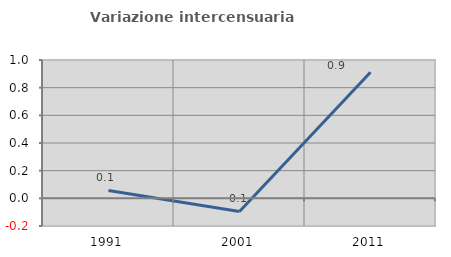
| Category | Variazione intercensuaria annua |
|---|---|
| 1991.0 | 0.057 |
| 2001.0 | -0.095 |
| 2011.0 | 0.912 |